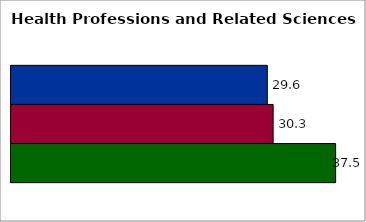
| Category | 50 states and D.C. | SREB states | State |
|---|---|---|---|
| 0 | 29.632 | 30.306 | 37.531 |